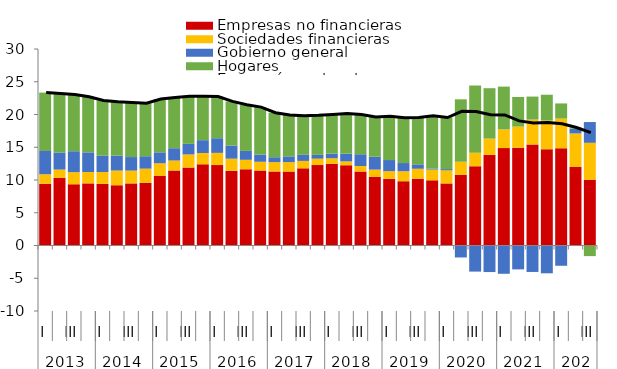
| Category | Empresas no financieras | Sociedades financieras | Gobierno general | Hogares |
|---|---|---|---|---|
| 0 | 9.43 | 1.445 | 3.552 | 8.92 |
| 1 | 10.334 | 1.259 | 2.606 | 9.016 |
| 2 | 9.351 | 1.843 | 3.2 | 8.661 |
| 3 | 9.485 | 1.731 | 3.004 | 8.482 |
| 4 | 9.413 | 1.801 | 2.489 | 8.448 |
| 5 | 9.201 | 2.243 | 2.283 | 8.221 |
| 6 | 9.48 | 1.954 | 2.069 | 8.33 |
| 7 | 9.568 | 2.162 | 1.899 | 8.08 |
| 8 | 10.63 | 1.925 | 1.669 | 8.127 |
| 9 | 11.447 | 1.528 | 1.879 | 7.743 |
| 10 | 11.898 | 2.001 | 1.618 | 7.259 |
| 11 | 12.394 | 1.724 | 1.963 | 6.697 |
| 12 | 12.277 | 1.865 | 2.236 | 6.354 |
| 13 | 11.426 | 1.831 | 1.997 | 6.748 |
| 14 | 11.637 | 1.446 | 1.36 | 7.041 |
| 15 | 11.439 | 1.346 | 1.097 | 7.245 |
| 16 | 11.311 | 1.42 | 0.746 | 6.8 |
| 17 | 11.291 | 1.436 | 0.88 | 6.318 |
| 18 | 11.776 | 1.138 | 0.932 | 5.956 |
| 19 | 12.281 | 0.974 | 0.582 | 6.038 |
| 20 | 12.476 | 0.841 | 0.705 | 5.99 |
| 21 | 12.254 | 0.59 | 1.178 | 6.146 |
| 22 | 11.315 | 0.817 | 1.8 | 6.062 |
| 23 | 10.466 | 1.122 | 1.973 | 6.073 |
| 24 | 10.169 | 1.178 | 1.702 | 6.674 |
| 25 | 9.817 | 1.518 | 1.255 | 6.927 |
| 26 | 10.189 | 1.527 | 0.672 | 7.138 |
| 27 | 9.948 | 1.644 | 0.142 | 8.091 |
| 28 | 9.476 | 1.998 | 0.192 | 7.866 |
| 29 | 10.772 | 2.015 | -1.825 | 9.528 |
| 30 | 12.099 | 2.059 | -3.985 | 10.285 |
| 31 | 13.836 | 2.485 | -4.053 | 7.696 |
| 32 | 14.869 | 2.854 | -4.317 | 6.535 |
| 33 | 14.926 | 3.223 | -3.646 | 4.525 |
| 34 | 15.42 | 3.806 | -4.037 | 3.511 |
| 35 | 14.695 | 4.382 | -4.243 | 3.938 |
| 36 | 14.847 | 4.529 | -3.094 | 2.314 |
| 37 | 11.987 | 5.123 | 0.722 | 0.18 |
| 38 | 10.028 | 5.651 | 3.169 | -1.621 |